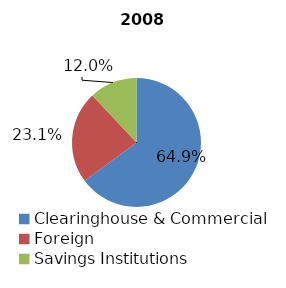
| Category | 2008 |
|---|---|
| Clearinghouse & Commercial | 471 |
| Foreign | 168 |
| Savings Institutions | 87 |